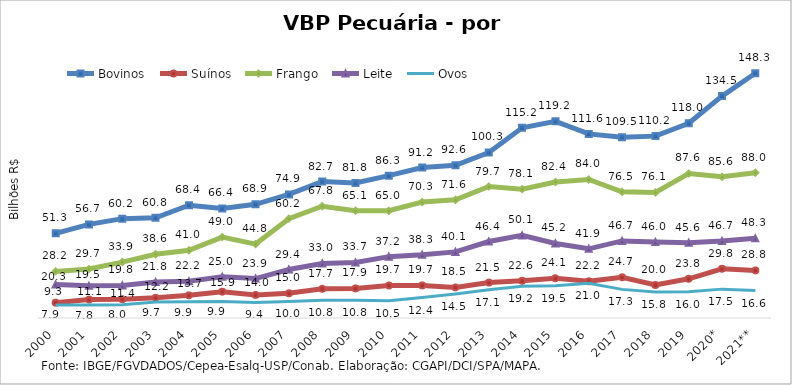
| Category | Bovinos | Suínos | Frango | Leite | Ovos |
|---|---|---|---|---|---|
| 2000 | 51.327 | 9.294 | 28.243 | 20.274 | 7.927 |
| 2001 | 56.737 | 11.15 | 29.686 | 19.509 | 7.811 |
| 2002 | 60.209 | 11.428 | 33.885 | 19.754 | 8.048 |
| 2003 | 60.767 | 12.213 | 38.632 | 21.754 | 9.735 |
| 2004 | 68.37 | 13.731 | 41.022 | 22.233 | 9.866 |
| 2005 | 66.377 | 15.92 | 49.044 | 25.006 | 9.933 |
| 2006 | 68.916 | 14.004 | 44.804 | 23.885 | 9.436 |
| 2007 | 74.895 | 14.975 | 60.199 | 29.364 | 10.028 |
| 2008 | 82.693 | 17.732 | 67.764 | 33.032 | 10.83 |
| 2009 | 81.831 | 17.924 | 65.063 | 33.677 | 10.799 |
| 2010 | 86.274 | 19.718 | 64.985 | 37.191 | 10.503 |
| 2011 | 91.206 | 19.749 | 70.284 | 38.34 | 12.376 |
| 2012 | 92.565 | 18.543 | 71.596 | 40.064 | 14.508 |
| 2013 | 100.308 | 21.47 | 79.687 | 46.362 | 17.063 |
| 2014 | 115.235 | 22.551 | 78.075 | 50.064 | 19.171 |
| 2015 | 119.201 | 24.1 | 82.423 | 45.192 | 19.52 |
| 2016 | 111.578 | 22.241 | 83.984 | 41.933 | 21.043 |
| 2017 | 109.494 | 24.689 | 76.494 | 46.722 | 17.345 |
| 2018 | 110.228 | 19.995 | 76.077 | 46.027 | 15.773 |
| 2019 | 118.03 | 23.766 | 87.595 | 45.601 | 15.974 |
| 2020* | 134.49 | 29.829 | 85.564 | 46.673 | 17.499 |
| 2021** | 148.332 | 28.835 | 88.036 | 48.291 | 16.63 |